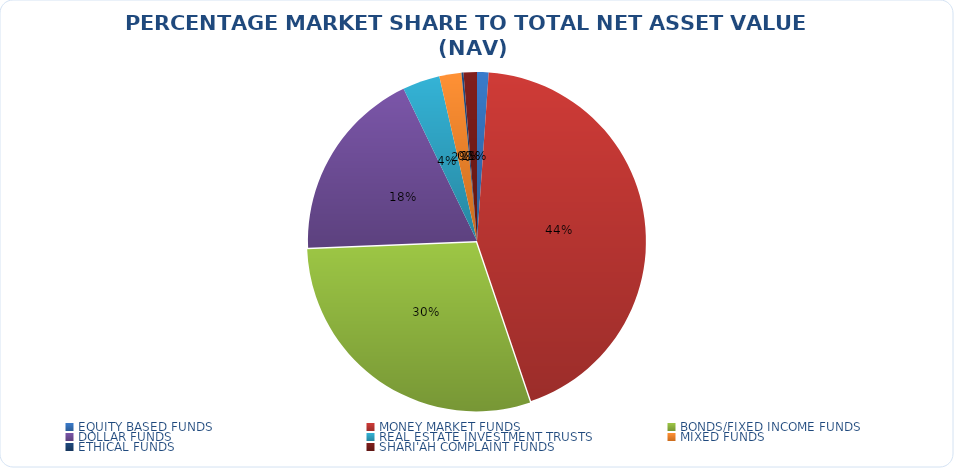
| Category | NET ASSET VALUE |
|---|---|
| EQUITY BASED FUNDS | 15663840381.52 |
| MONEY MARKET FUNDS | 618846705047.35 |
| BONDS/FIXED INCOME FUNDS | 418300153052.87 |
| DOLLAR FUNDS | 261629244953.67 |
| REAL ESTATE INVESTMENT TRUSTS | 50587187904.15 |
| MIXED FUNDS | 29936543532.98 |
| ETHICAL FUNDS | 2725121827.45 |
| SHARI'AH COMPLAINT FUNDS | 18057949258.94 |